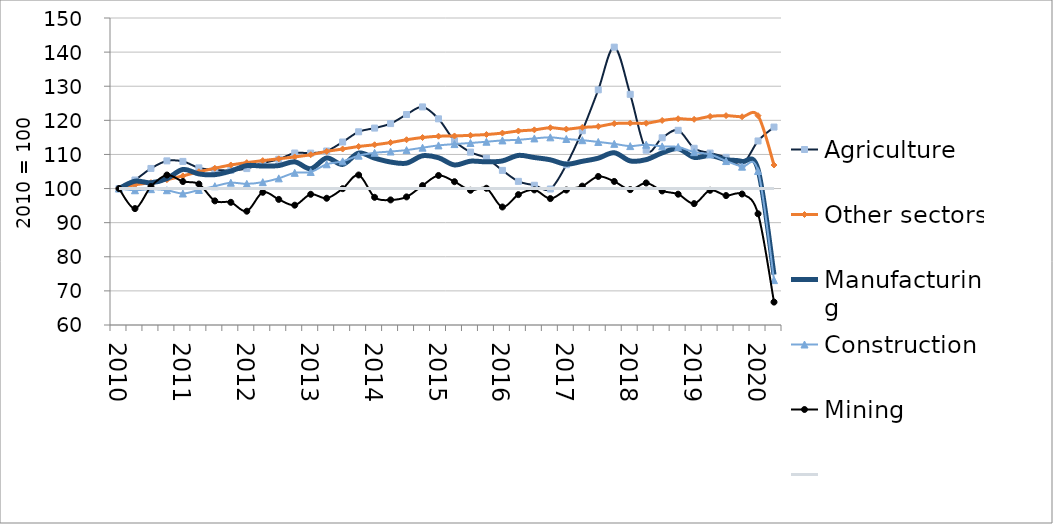
| Category | Agriculture | Other sectors | Manufacturing | Construction | Mining | Series 5 |
|---|---|---|---|---|---|---|
| 2010.0 | 100 | 100 | 100 | 100 | 100 | 100 |
| nan | 102.508 | 101.091 | 102.157 | 99.503 | 94.129 | 100 |
| nan | 105.898 | 101.733 | 101.692 | 99.821 | 100.594 | 100 |
| nan | 108.112 | 102.595 | 102.914 | 99.51 | 103.965 | 100 |
| 2011.0 | 107.962 | 103.718 | 105.605 | 98.548 | 102.066 | 100 |
| nan | 106.063 | 104.923 | 104.289 | 99.592 | 101.319 | 100 |
| nan | 105.46 | 105.954 | 104.076 | 100.688 | 96.388 | 100 |
| nan | 105.339 | 106.909 | 105.134 | 101.707 | 95.965 | 100 |
| 2012.0 | 105.854 | 107.6 | 106.728 | 101.378 | 93.363 | 100 |
| nan | 107.459 | 108.193 | 106.599 | 101.872 | 98.904 | 100 |
| nan | 108.583 | 108.722 | 106.737 | 102.992 | 96.823 | 100 |
| nan | 110.419 | 109.272 | 107.827 | 104.613 | 95.129 | 100 |
| 2013.0 | 110.384 | 109.915 | 105.811 | 104.86 | 98.316 | 100 |
| nan | 111.017 | 110.905 | 108.96 | 107.121 | 97.157 | 100 |
| nan | 113.642 | 111.588 | 107.076 | 107.98 | 99.969 | 100 |
| nan | 116.64 | 112.332 | 110.402 | 109.647 | 103.976 | 100 |
| 2014.0 | 117.727 | 112.84 | 108.919 | 110.481 | 97.43 | 100 |
| nan | 119.041 | 113.492 | 107.776 | 110.855 | 96.669 | 100 |
| nan | 121.7 | 114.313 | 107.454 | 111.275 | 97.554 | 100 |
| nan | 123.936 | 114.96 | 109.602 | 111.979 | 100.874 | 100 |
| 2015.0 | 120.436 | 115.34 | 109.037 | 112.649 | 103.839 | 100 |
| nan | 114.019 | 115.415 | 106.919 | 113.036 | 102.017 | 100 |
| nan | 110.677 | 115.611 | 108.023 | 113.358 | 99.494 | 100 |
| nan | 108.908 | 115.84 | 107.825 | 113.726 | 100.083 | 100 |
| 2016.0 | 105.327 | 116.262 | 108.103 | 114.109 | 94.594 | 100 |
| nan | 102.112 | 116.876 | 109.716 | 114.291 | 98.223 | 100 |
| nan | 100.962 | 117.206 | 109.097 | 114.696 | 99.612 | 100 |
| nan | 99.867 | 117.835 | 108.428 | 115.016 | 97.06 | 100 |
| 2017.0 | 106.974 | 117.426 | 107.149 | 114.526 | 99.575 | 100 |
| nan | 116.944 | 117.927 | 107.99 | 114.177 | 100.709 | 100 |
| nan | 128.936 | 118.206 | 108.902 | 113.666 | 103.54 | 100 |
| nan | 141.455 | 119.036 | 110.493 | 113.106 | 102.084 | 100 |
| 2018.0 | 127.624 | 119.173 | 108.098 | 112.447 | 99.684 | 100 |
| nan | 111.24 | 119.148 | 108.481 | 112.859 | 101.639 | 100 |
| nan | 114.881 | 119.968 | 110.459 | 112.371 | 99.3 | 100 |
| nan | 117.073 | 120.471 | 111.686 | 112.185 | 98.348 | 100 |
| 2019.0 | 111.809 | 120.29 | 109.144 | 110.674 | 95.586 | 100 |
| nan | 110.408 | 121.151 | 109.7 | 110.014 | 99.497 | 100 |
| nan | 109.149 | 121.378 | 108.46 | 108.064 | 97.946 | 100 |
| nan | 107.016 | 121.049 | 107.958 | 106.424 | 98.396 | 100 |
| 2020.0 | 113.953 | 121.366 | 105.594 | 105.153 | 92.604 | 100 |
| nan | 118.027 | 106.898 | 74.768 | 73.163 | 66.718 | 100 |